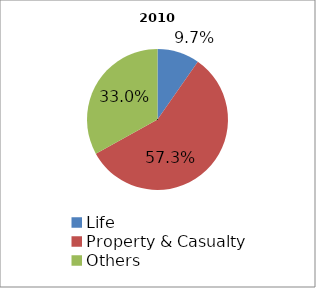
| Category | 2010 |
|---|---|
| Life | 105525220 |
| Property & Casualty | 623331496 |
| Others | 359720453 |